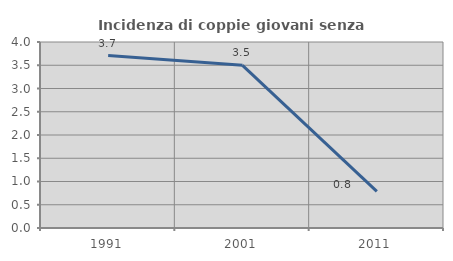
| Category | Incidenza di coppie giovani senza figli |
|---|---|
| 1991.0 | 3.709 |
| 2001.0 | 3.497 |
| 2011.0 | 0.786 |